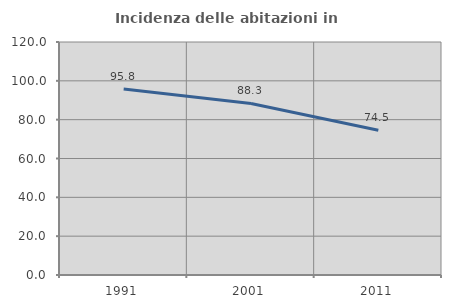
| Category | Incidenza delle abitazioni in proprietà  |
|---|---|
| 1991.0 | 95.833 |
| 2001.0 | 88.333 |
| 2011.0 | 74.51 |